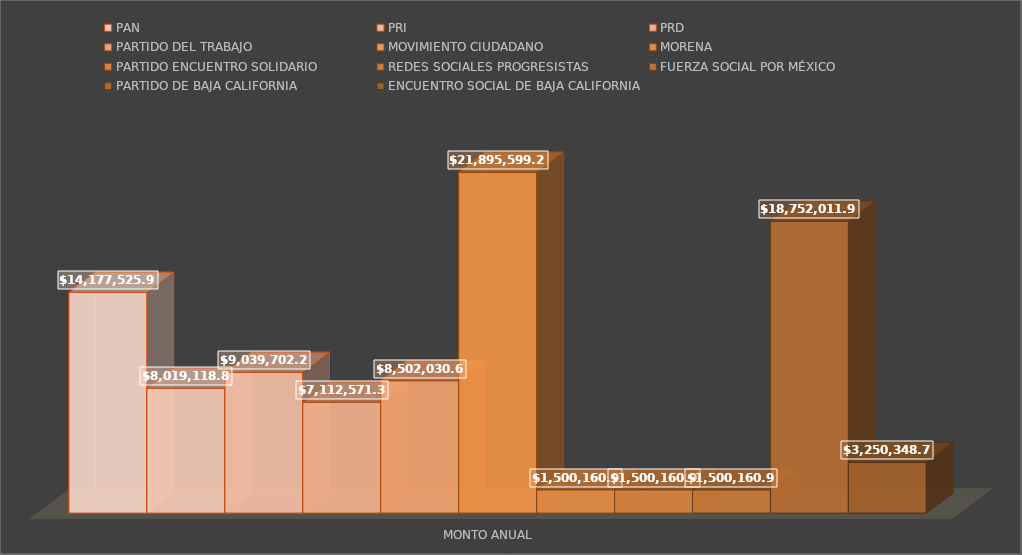
| Category | PAN | PRI | PRD | PARTIDO DEL TRABAJO | MOVIMIENTO CIUDADANO | MORENA | PARTIDO ENCUENTRO SOLIDARIO | REDES SOCIALES PROGRESISTAS | FUERZA SOCIAL POR MÉXICO | PARTIDO DE BAJA CALIFORNIA | ENCUENTRO SOCIAL DE BAJA CALIFORNIA |
|---|---|---|---|---|---|---|---|---|---|---|---|
| MONTO ANUAL | 14177525.92 | 8019118.87 | 9039702.21 | 7112571.39 | 8502030.64 | 21895599.21 | 1500160.96 | 1500160.96 | 1500160.96 | 18752011.96 | 3250348.74 |